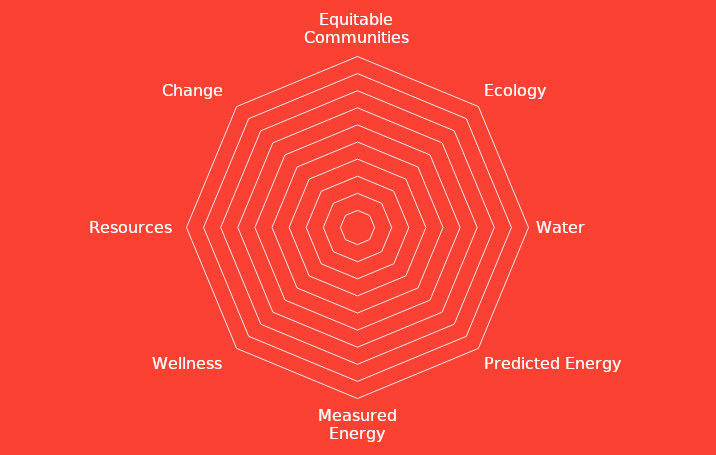
| Category | Series 0 |
|---|---|
| Equitable Communities | 0 |
| Ecology | 0 |
| Water | 0 |
| Predicted Energy | 0 |
| Measured Energy | 0 |
| Wellness | 0 |
| Resources | 0 |
| Change | 0 |